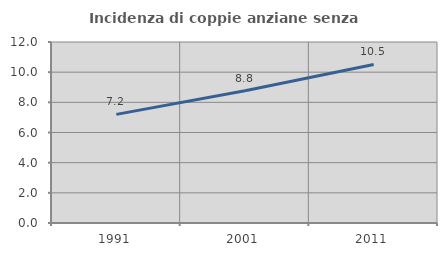
| Category | Incidenza di coppie anziane senza figli  |
|---|---|
| 1991.0 | 7.202 |
| 2001.0 | 8.768 |
| 2011.0 | 10.514 |